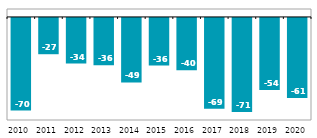
| Category | CZK billion |
|---|---|
| 2010 | -70.107 |
| 2011 | -27.464 |
| 2012 | -34.494 |
| 2013 | -35.753 |
| 2014 | -48.794 |
| 2015 | -36.044 |
| 2016 | -39.59 |
| 2017 | -68.638 |
| 2018 | -71.24 |
| 2019 | -54.449 |
| 2020 | -60.502 |